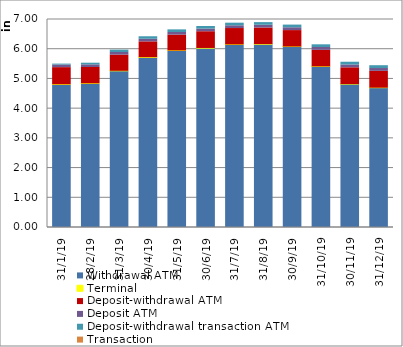
| Category | Withdrawal ATM | Terminal | Deposit-withdrawal ATM | Deposit ATM | Deposit-withdrawal transaction ATM | Transaction |
|---|---|---|---|---|---|---|
| 2019-01-31 | 4793 | 9 | 578 | 88 | 31 | 1 |
| 2019-02-28 | 4825 | 9 | 551 | 88 | 56 | 1 |
| 2019-03-31 | 5248 | 9 | 544 | 88 | 80 | 1 |
| 2019-04-30 | 5705 | 9 | 533 | 88 | 84 | 1 |
| 2019-05-31 | 5932 | 9 | 533 | 89 | 88 | 1 |
| 2019-06-30 | 6017 | 8 | 563 | 89 | 88 | 1 |
| 2019-07-31 | 6136 | 7 | 553 | 92 | 88 | 1 |
| 2019-08-31 | 6150 | 5 | 558 | 94 | 88 | 1 |
| 2019-09-30 | 6072 | 1 | 554 | 94 | 91 | 1 |
| 2019-10-31 | 5403 | 1 | 558 | 95 | 91 | 1 |
| 2019-11-30 | 4809 | 1 | 564 | 95 | 93 | 1 |
| 2019-12-31 | 4687 | 1 | 567 | 95 | 95 | 1 |